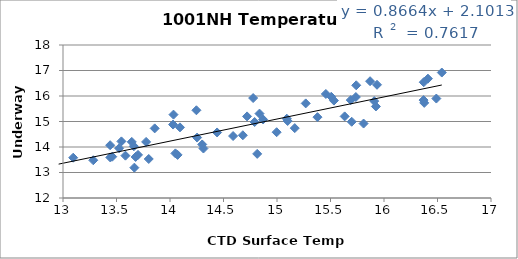
| Category | Series 0 |
|---|---|
| 15.737 | 15.96 |
| 15.689 | 15.84 |
| 15.50695 | 15.97 |
| 15.7405 | 16.42 |
| 15.9346 | 16.44 |
| 16.36965 | 15.84 |
| 16.3761 | 15.73 |
| 15.6982 | 14.99 |
| 14.77705 | 15.92 |
| 15.869800000000001 | 16.58 |
| 16.37145 | 16.54 |
| 16.54015 | 16.92 |
| 16.41045 | 16.68 |
| 16.489150000000002 | 15.9 |
| 15.809000000000001 | 14.92 |
| 14.790949999999999 | 14.98 |
| 14.72035 | 15.2 |
| 15.0915 | 15.11 |
| 14.996749999999999 | 14.58 |
| 15.9086 | 15.8 |
| 15.6323 | 15.2 |
| 15.37835 | 15.17 |
| 15.1659 | 14.74 |
| 14.8701 | 15.08 |
| 15.09955 | 15.02 |
| 14.44015 | 14.57 |
| 14.0326 | 15.27 |
| 15.4565 | 16.08 |
| 15.9245 | 15.59 |
| 15.532250000000001 | 15.82 |
| 15.2685 | 15.71 |
| 14.81485 | 13.73 |
| 13.54585 | 14.22 |
| 13.6623 | 14.03 |
| 13.85695 | 14.73 |
| 14.0932 | 14.77 |
| 14.2468 | 15.44 |
| 14.68065 | 14.46 |
| 14.589649999999999 | 14.43 |
| 14.25345 | 14.37 |
| 14.3011 | 14.1 |
| 14.3125 | 13.94 |
| 13.8014 | 13.53 |
| 13.4408 | 14.07 |
| 14.0286 | 14.88 |
| 14.836549999999999 | 15.31 |
| 13.5246 | 13.95 |
| 13.7012 | 13.69 |
| 13.6428 | 14.2 |
| 13.776900000000001 | 14.2 |
| 14.07105 | 13.69 |
| 14.0504 | 13.75 |
| 13.44195 | 13.59 |
| 13.282800000000002 | 13.48 |
| 13.0954 | 13.58 |
| 12.959150000000001 | 13.19 |
| 13.66695 | 13.19 |
| 13.58345 | 13.66 |
| 13.4603 | 13.62 |
| 13.6786 | 13.61 |